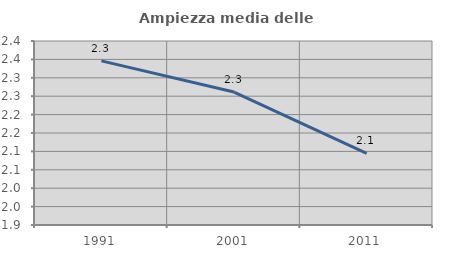
| Category | Ampiezza media delle famiglie |
|---|---|
| 1991.0 | 2.346 |
| 2001.0 | 2.261 |
| 2011.0 | 2.095 |